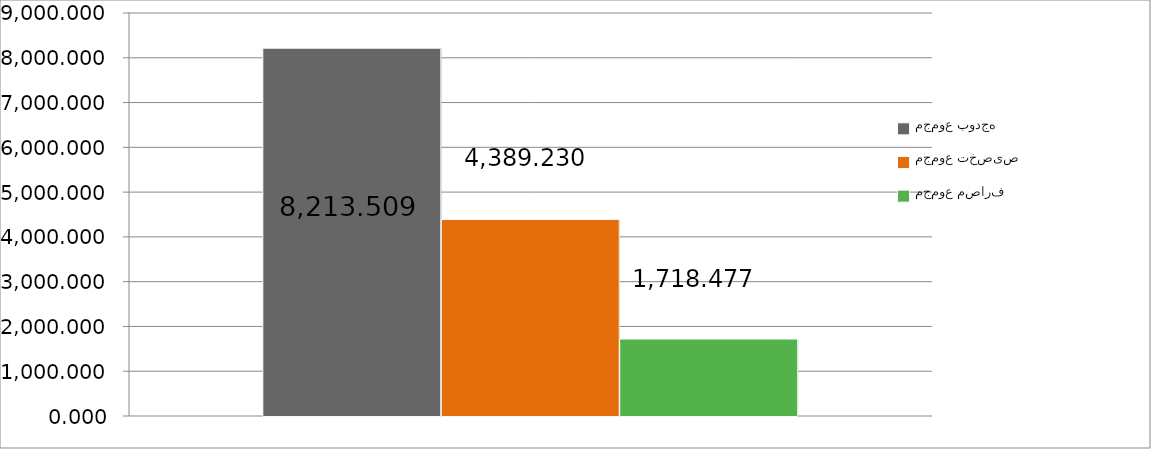
| Category | مجموع بودجه  | مجموع تخصیص | مجموع مصارف |
|---|---|---|---|
| 0 | 8213.509 | 4389.23 | 1718.477 |